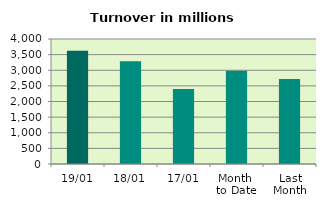
| Category | Series 0 |
|---|---|
| 19/01 | 3626.869 |
| 18/01 | 3287.368 |
| 17/01 | 2396.015 |
| Month 
to Date | 2984.822 |
| Last
Month | 2717.391 |